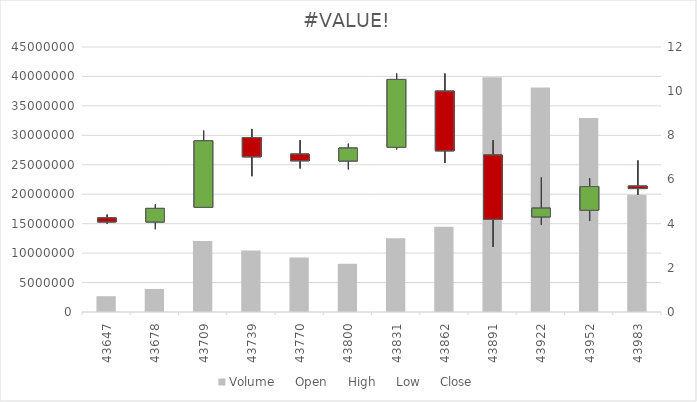
| Category | Volume |
|---|---|
| 7/1/19 | 2684540 |
| 8/1/19 | 3915477 |
| 9/1/19 | 12038855 |
| 10/1/19 | 10455336 |
| 11/1/19 | 9270347 |
| 12/1/19 | 8182165 |
| 1/1/20 | 12506517 |
| 2/1/20 | 14486794 |
| 3/1/20 | 39858029 |
| 4/1/20 | 38111821 |
| 5/1/20 | 32952062 |
| 6/1/20 | 19901891 |